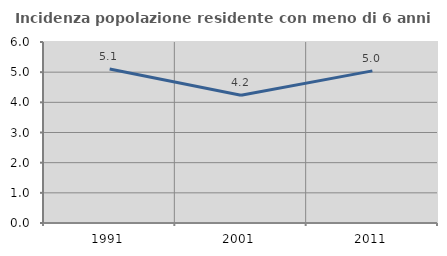
| Category | Incidenza popolazione residente con meno di 6 anni |
|---|---|
| 1991.0 | 5.102 |
| 2001.0 | 4.233 |
| 2011.0 | 5.042 |